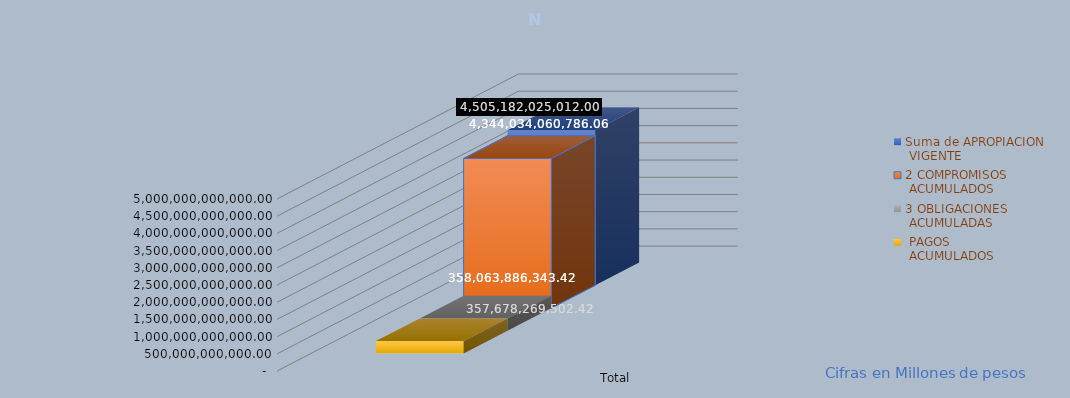
| Category | Suma de APROPIACION
 VIGENTE | 2 COMPROMISOS
 ACUMULADOS | 3 OBLIGACIONES
 ACUMULADAS |  PAGOS
 ACUMULADOS |
|---|---|---|---|---|
| Total | 4505182025012 | 4344034060786.06 | 358063886343.42 | 357678269502.42 |